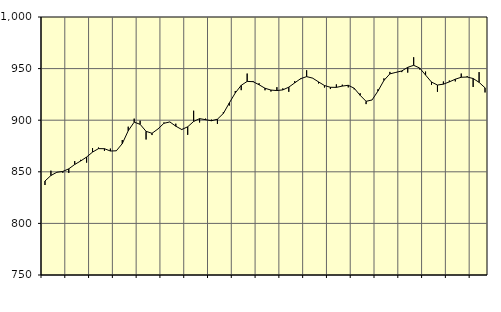
| Category | Piggar | Series 1 |
|---|---|---|
| nan | 837.2 | 841.06 |
| 1.0 | 851.1 | 846.41 |
| 1.0 | 849.7 | 849.55 |
| 1.0 | 849.1 | 850.34 |
| nan | 848.9 | 852.86 |
| 2.0 | 860.4 | 857.1 |
| 2.0 | 861.6 | 860.46 |
| 2.0 | 858.9 | 864.3 |
| nan | 872.9 | 869.09 |
| 3.0 | 873.5 | 872.45 |
| 3.0 | 870.3 | 872.39 |
| 3.0 | 872.5 | 870.13 |
| nan | 870.6 | 870.34 |
| 4.0 | 880.8 | 877.29 |
| 4.0 | 893.7 | 889.75 |
| 4.0 | 901.5 | 898.12 |
| nan | 899.5 | 896 |
| 5.0 | 881.3 | 889.21 |
| 5.0 | 885.6 | 887.3 |
| 5.0 | 891.4 | 891.49 |
| nan | 897.8 | 897 |
| 6.0 | 898.4 | 898.31 |
| 6.0 | 896.6 | 894.19 |
| 6.0 | 890.5 | 890.98 |
| nan | 885.8 | 893.61 |
| 7.0 | 909.2 | 898.78 |
| 7.0 | 897.8 | 901.5 |
| 7.0 | 901.5 | 900.51 |
| nan | 900.5 | 899.45 |
| 8.0 | 896.4 | 900.97 |
| 8.0 | 907.9 | 906.56 |
| 8.0 | 914.2 | 916.73 |
| nan | 928.3 | 926.4 |
| 9.0 | 929.1 | 933.8 |
| 9.0 | 945.2 | 937.59 |
| 9.0 | 938 | 937.34 |
| nan | 935.8 | 934.34 |
| 10.0 | 929 | 930.95 |
| 10.0 | 927.8 | 929.19 |
| 10.0 | 932 | 928.72 |
| nan | 930.8 | 929.37 |
| 11.0 | 927.5 | 932.01 |
| 11.0 | 937.9 | 936.18 |
| 11.0 | 939.8 | 940.27 |
| nan | 948.4 | 942.21 |
| 12.0 | 940.9 | 940.8 |
| 12.0 | 935.6 | 937.13 |
| 12.0 | 931.7 | 933.6 |
| nan | 930.2 | 931.9 |
| 13.0 | 934.7 | 931.81 |
| 13.0 | 934.4 | 933.06 |
| 13.0 | 931.8 | 933.83 |
| nan | 929.9 | 930.96 |
| 14.0 | 926.1 | 924.11 |
| 14.0 | 915.6 | 918.3 |
| 14.0 | 919.5 | 919.59 |
| nan | 930 | 928.27 |
| 15.0 | 940.5 | 938.53 |
| 15.0 | 946.8 | 944.88 |
| 15.0 | 946 | 946.34 |
| nan | 946.6 | 947.71 |
| 16.0 | 946.1 | 951.22 |
| 16.0 | 961 | 953.18 |
| 16.0 | 949.2 | 950.61 |
| nan | 947.1 | 943.76 |
| 17.0 | 934.3 | 936.94 |
| 17.0 | 927.5 | 934.07 |
| 17.0 | 937.5 | 934.92 |
| nan | 938.4 | 937.14 |
| 18.0 | 937.6 | 939.72 |
| 18.0 | 945.2 | 941.61 |
| 18.0 | 942.7 | 941.83 |
| nan | 932.2 | 940.4 |
| 19.0 | 946.6 | 936.68 |
| 19.0 | 926.9 | 931.38 |